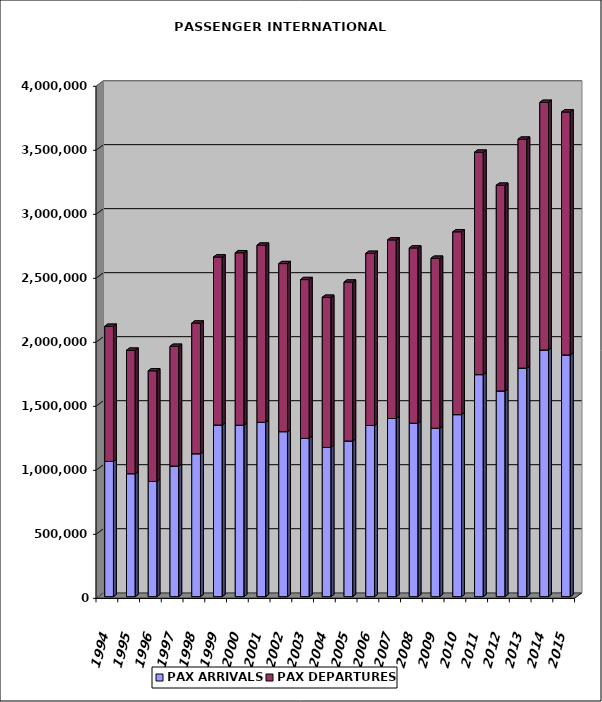
| Category | PAX ARRIVALS | PAX DEPARTURES |
|---|---|---|
| 1994.0 | 1056560 | 1055154 |
| 1995.0 | 960586 | 964336 |
| 1996.0 | 899809 | 864312 |
| 1997.0 | 1019876 | 935651 |
| 1998.0 | 1116611 | 1020417 |
| 1999.0 | 1340709 | 1312420 |
| 2000.0 | 1339139 | 1347351 |
| 2001.0 | 1361783 | 1383923 |
| 2002.0 | 1288923 | 1312723 |
| 2003.0 | 1236553 | 1240202 |
| 2004.0 | 1165843 | 1172807 |
| 2005.0 | 1215771 | 1241267 |
| 2006.0 | 1336884 | 1344673 |
| 2007.0 | 1391615 | 1395021 |
| 2008.0 | 1354921 | 1369019 |
| 2009.0 | 1315479 | 1327955 |
| 2010.0 | 1421955 | 1428051 |
| 2011.0 | 1734418 | 1737505 |
| 2012.0 | 1606843 | 1606937 |
| 2013.0 | 1785305 | 1788160 |
| 2014.0 | 1926675 | 1934341 |
| 2015.0 | 1888181 | 1897817 |